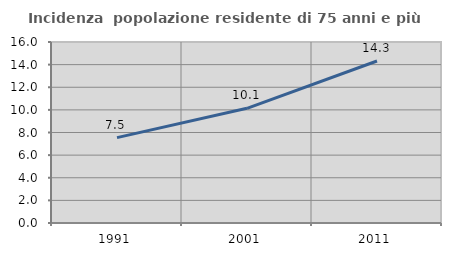
| Category | Incidenza  popolazione residente di 75 anni e più |
|---|---|
| 1991.0 | 7.546 |
| 2001.0 | 10.138 |
| 2011.0 | 14.319 |